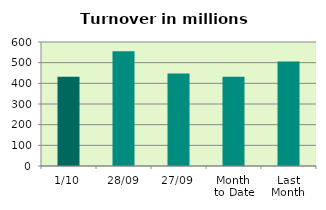
| Category | Series 0 |
|---|---|
| 1/10 | 431.995 |
| 28/09 | 554.993 |
| 27/09 | 448.044 |
| Month 
to Date | 431.995 |
| Last
Month | 505.274 |